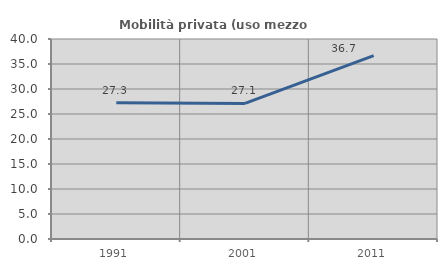
| Category | Mobilità privata (uso mezzo privato) |
|---|---|
| 1991.0 | 27.273 |
| 2001.0 | 27.119 |
| 2011.0 | 36.667 |